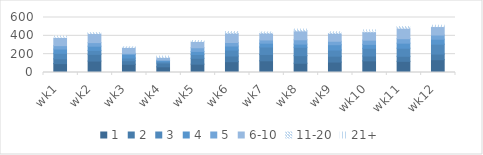
| Category | 1 | 2 | 3 | 4 | 5 | 6-10 | 11-20 | 21+ |
|---|---|---|---|---|---|---|---|---|
| wk1 | 97 | 52 | 60 | 47 | 37 | 90 | 6 | 7 |
| wk2 | 125 | 73 | 43 | 46 | 39 | 99 | 8 | 1 |
| wk3 | 90 | 38 | 30 | 39 | 12 | 65 | 4 | 2 |
| wk4 | 62 | 41 | 14 | 14 | 6 | 28 | 6 | 8 |
| wk5 | 91 | 64 | 41 | 34 | 40 | 68 | 6 | 5 |
| wk6 | 118 | 62 | 65 | 44 | 38 | 102 | 14 | 4 |
| wk7 | 128 | 69 | 81 | 42 | 35 | 75 | 10 | 2 |
| wk8 | 101 | 83 | 91 | 35 | 47 | 98 | 14 | 5 |
| wk9 | 114 | 64 | 67 | 58 | 38 | 87 | 12 | 5 |
| wk10 | 127 | 53 | 84 | 43 | 46 | 91 | 9 | 12 |
| wk11 | 122 | 55 | 88 | 55 | 49 | 115 | 15 | 2 |
| wk12 | 140 | 61 | 108 | 54 | 46 | 92 | 4 | 11 |